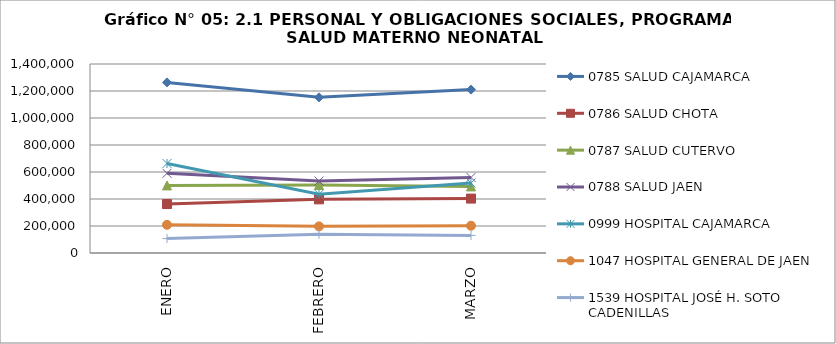
| Category | 0785 SALUD CAJAMARCA | 0786 SALUD CHOTA | 0787 SALUD CUTERVO | 0788 SALUD JAEN | 0999 HOSPITAL CAJAMARCA | 1047 HOSPITAL GENERAL DE JAEN | 1539 HOSPITAL JOSÉ H. SOTO CADENILLAS |
|---|---|---|---|---|---|---|---|
| ENERO | 1263815 | 362896 | 500614 | 590317 | 662986 | 208983 | 107029 |
| FEBRERO | 1152847 | 397346 | 503633 | 533265 | 435105 | 197238 | 138734 |
| MARZO | 1210260 | 403115 | 493074 | 559603 | 518785 | 201894 | 130144 |